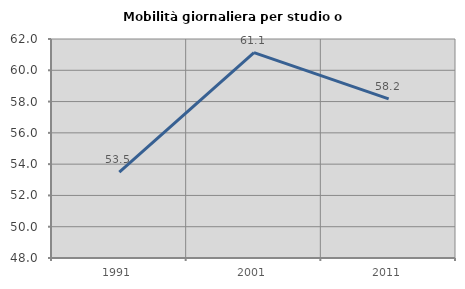
| Category | Mobilità giornaliera per studio o lavoro |
|---|---|
| 1991.0 | 53.483 |
| 2001.0 | 61.128 |
| 2011.0 | 58.175 |